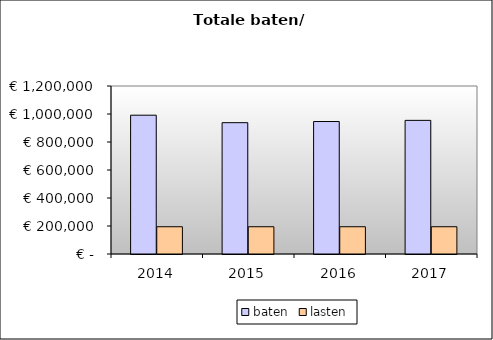
| Category | baten | lasten |
|---|---|---|
| 2014.0 | 991438.473 | 194671.87 |
| 2015.0 | 937947.347 | 194671.87 |
| 2016.0 | 946225.947 | 194671.87 |
| 2017.0 | 954504.547 | 194671.87 |